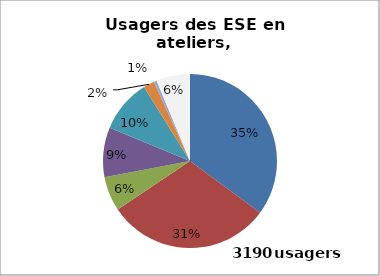
| Category | AT |
|---|---|
| déficience intellectuelle | 1373 |
| troubles psychiques | 1192 |
| addiction | 251 |
| autre/hors périmètre | 361 |
| déficience physique | 387 |
| déficience sensorielle | 80 |
| polyhandicap | 21 |
| non indiqué | 245 |